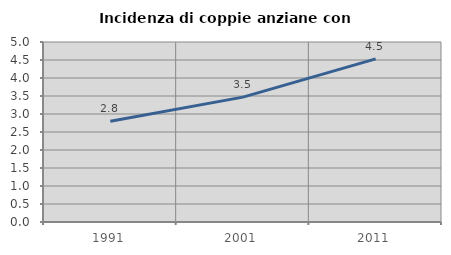
| Category | Incidenza di coppie anziane con figli |
|---|---|
| 1991.0 | 2.801 |
| 2001.0 | 3.469 |
| 2011.0 | 4.532 |